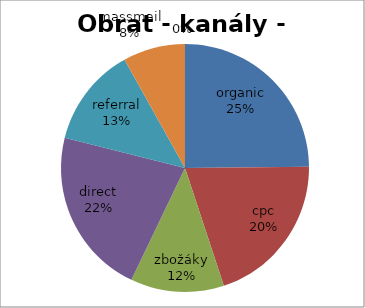
| Category | Series 0 |
|---|---|
| organic | 1128459.892 |
| cpc | 911382.907 |
| zbožáky | 553269.568 |
| direct | 989773.303 |
| referral | 589392.394 |
| massmail | 367864.447 |